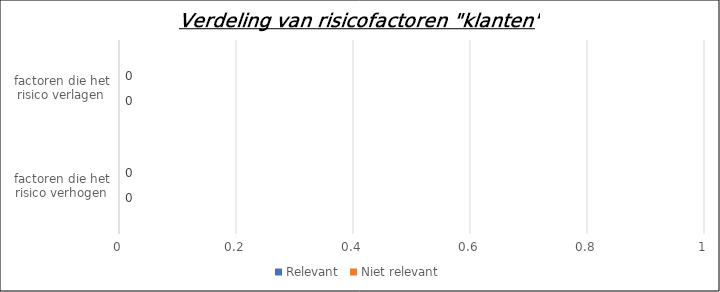
| Category | Relevant | Niet relevant |
|---|---|---|
| factoren die het risico verhogen | 0 | 0 |
| factoren die het risico verlagen | 0 | 0 |